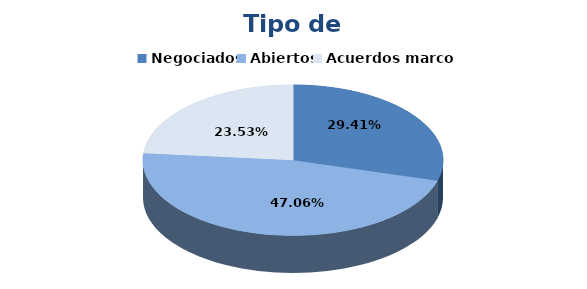
| Category | Series 0 |
|---|---|
| Negociados | 5 |
| Abiertos | 8 |
| Acuerdos marco | 4 |